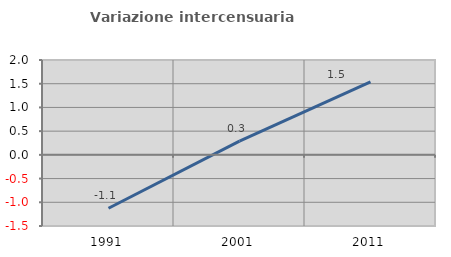
| Category | Variazione intercensuaria annua |
|---|---|
| 1991.0 | -1.126 |
| 2001.0 | 0.29 |
| 2011.0 | 1.537 |